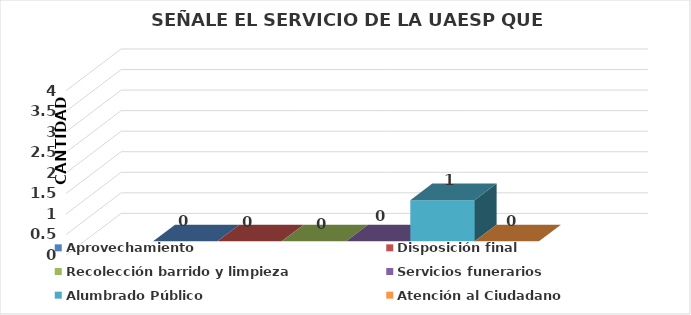
| Category | Aprovechamiento | Disposición final | Recolección barrido y limpieza | Servicios funerarios | Alumbrado Público | Atención al Ciudadano |
|---|---|---|---|---|---|---|
| 0 | 0 | 0 | 0 | 0 | 1 | 0 |